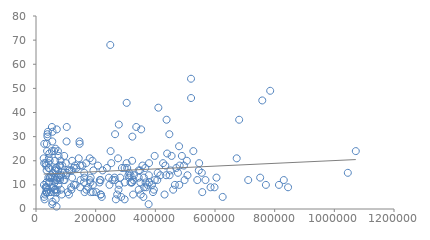
| Category | Series 0 |
|---|---|
| 1071904.0 | 24 |
| 751381.0 | 13 |
| 488889.0 | 22 |
| 830504.0 | 12 |
| 322961.0 | 30 |
| 1045186.0 | 15 |
| 264112.0 | 12 |
| 545703.0 | 16 |
| 758388.0 | 45 |
| 814389.0 | 10 |
| 519895.0 | 46 |
| 784999.0 | 49 |
| 447005.0 | 31 |
| 465445.0 | 10 |
| 161969.0 | 13 |
| 844938.0 | 9 |
| 585132.0 | 9 |
| 711386.0 | 12 |
| 770559.0 | 10 |
| 680983.0 | 37 |
| 349902.0 | 11 |
| 527492.0 | 24 |
| 625620.0 | 5 |
| 145769.0 | 28 |
| 278743.0 | 10 |
| 481594.0 | 18 |
| 439557.0 | 23 |
| 213122.0 | 11 |
| 180212.0 | 21 |
| 272065.0 | 6 |
| 454516.0 | 22 |
| 95571.0 | 12 |
| 495932.0 | 18 |
| 309699.0 | 14 |
| 479572.0 | 26 |
| 557394.0 | 7 |
| 546922.0 | 19 |
| 62840.0 | 11 |
| 249013.0 | 68 |
| 360007.0 | 5 |
| 80077.0 | 12 |
| 244430.0 | 13 |
| 33721.0 | 7 |
| 155574.0 | 18 |
| 433401.0 | 18 |
| 216576.0 | 12 |
| 297265.0 | 11 |
| 68920.0 | 1 |
| 237603.0 | 17 |
| 380225.0 | 11 |
| 540726.0 | 12 |
| 78867.0 | 14 |
| 162865.0 | 7 |
| 555796.0 | 15 |
| 450505.0 | 16 |
| 66255.0 | 16 |
| 321465.0 | 11 |
| 672751.0 | 21 |
| 325439.0 | 6 |
| 447680.0 | 14 |
| 223271.0 | 16 |
| 598332.0 | 9 |
| 430863.0 | 6 |
| 168022.0 | 19 |
| 320991.0 | 11 |
| 78329.0 | 18 |
| 356779.0 | 18 |
| 497983.0 | 12 |
| 351134.0 | 6 |
| 130531.0 | 18 |
| 143215.0 | 21 |
| 416840.0 | 14 |
| 118641.0 | 8 |
| 93024.0 | 15 |
| 361740.0 | 13 |
| 55469.0 | 32 |
| 81076.0 | 13 |
| 146293.0 | 27 |
| 378814.0 | 19 |
| 410111.0 | 42 |
| 437665.0 | 37 |
| 305714.0 | 17 |
| 480170.0 | 10 |
| 296956.0 | 17 |
| 217584.0 | 6 |
| 99981.0 | 19 |
| 74994.0 | 10 |
| 147914.0 | 9 |
| 69011.0 | 8 |
| 120126.0 | 16 |
| 57490.0 | 15 |
| 57417.0 | 13 |
| 265075.0 | 31 |
| 135618.0 | 17 |
| 183169.0 | 7 |
| 275055.0 | 21 |
| 36241.0 | 27 |
| 70921.0 | 13 |
| 117819.0 | 9 |
| 190549.0 | 10 |
| 75713.0 | 22 |
| 336055.0 | 34 |
| 160636.0 | 11 |
| 102421.0 | 28 |
| 395178.0 | 8 |
| 49855.0 | 7 |
| 604923.0 | 13 |
| 93088.0 | 12 |
| 505702.0 | 20 |
| 94509.0 | 22 |
| 54505.0 | 28 |
| 392241.0 | 7 |
| 369869.0 | 9 |
| 68966.0 | 17 |
| 110551.0 | 16 |
| 168689.0 | 8 |
| 313115.0 | 15 |
| 377485.0 | 2 |
| 34819.0 | 11 |
| 74369.0 | 16 |
| 297114.0 | 4 |
| 111071.0 | 16 |
| 81135.0 | 18 |
| 35316.0 | 7 |
| 326683.0 | 12 |
| 41744.0 | 17 |
| 61069.0 | 7 |
| 344351.0 | 8 |
| 27215.0 | 5 |
| 55197.0 | 3 |
| 285542.0 | 5 |
| 367352.0 | 11 |
| 52508.0 | 13 |
| 348568.0 | 16 |
| 41458.0 | 13 |
| 161747.0 | 15 |
| 84470.0 | 14 |
| 43205.0 | 21 |
| 26777.0 | 10 |
| 397628.0 | 22 |
| 475862.0 | 15 |
| 277636.0 | 35 |
| 267827.0 | 4 |
| 366430.0 | 17 |
| 64124.0 | 20 |
| 216669.0 | 6 |
| 25742.0 | 21 |
| 42227.0 | 19 |
| 192425.0 | 16 |
| 202044.0 | 7 |
| 459794.0 | 8 |
| 102995.0 | 34 |
| 470244.0 | 17 |
| 175041.0 | 9 |
| 312510.0 | 13 |
| 148410.0 | 18 |
| 56791.0 | 9 |
| 127072.0 | 10 |
| 180270.0 | 12 |
| 39033.0 | 8 |
| 190877.0 | 7 |
| 73505.0 | 24 |
| 406678.0 | 12 |
| 88095.0 | 18 |
| 507750.0 | 14 |
| 52582.0 | 9 |
| 65745.0 | 17 |
| 568037.0 | 12 |
| 249971.0 | 24 |
| 183277.0 | 13 |
| 263344.0 | 13 |
| 27843.0 | 27 |
| 69929.0 | 7 |
| 378300.0 | 14 |
| 303571.0 | 19 |
| 252241.0 | 19 |
| 106455.0 | 7 |
| 44437.0 | 23 |
| 47119.0 | 13 |
| 288159.0 | 17 |
| 182230.0 | 11 |
| 46028.0 | 13 |
| 316945.0 | 14 |
| 282250.0 | 13 |
| 398128.0 | 12 |
| 126624.0 | 17 |
| 120868.0 | 13 |
| 121059.0 | 20 |
| 67759.0 | 12 |
| 110584.0 | 6 |
| 322172.0 | 20 |
| 344294.0 | 16 |
| 36479.0 | 7 |
| 44571.0 | 11 |
| 149389.0 | 12 |
| 28676.0 | 4 |
| 373745.0 | 10 |
| 207589.0 | 18 |
| 38192.0 | 31 |
| 43710.0 | 11 |
| 39917.0 | 32 |
| 32409.0 | 9 |
| 32242.0 | 19 |
| 54451.0 | 2 |
| 53501.0 | 24 |
| 220323.0 | 5 |
| 213984.0 | 12 |
| 425904.0 | 19 |
| 65291.0 | 25 |
| 33518.0 | 9 |
| 66041.0 | 4 |
| 51331.0 | 14 |
| 69583.0 | 12 |
| 328336.0 | 14 |
| 27430.0 | 19 |
| 63858.0 | 16 |
| 407875.0 | 15 |
| 63443.0 | 13 |
| 246325.0 | 10 |
| 519625.0 | 54 |
| 33873.0 | 18 |
| 38373.0 | 30 |
| 303847.0 | 44 |
| 30643.0 | 6 |
| 43524.0 | 7 |
| 344256.0 | 13 |
| 60767.0 | 24 |
| 362442.0 | 9 |
| 316890.0 | 11 |
| 86593.0 | 6 |
| 82374.0 | 20 |
| 69702.0 | 33 |
| 352517.0 | 33 |
| 388592.0 | 10 |
| 436151.0 | 14 |
| 276674.0 | 8 |
| 36751.0 | 9 |
| 103929.0 | 15 |
| 63865.0 | 8 |
| 83178.0 | 8 |
| 132672.0 | 10 |
| 53307.0 | 34 |
| 189229.0 | 20 |
| 43438.0 | 17 |
| 35695.0 | 16 |
| 256159.0 | 12 |
| 37081.0 | 24 |
| 45893.0 | 20 |
| 100974.0 | 14 |
| 62517.0 | 8 |